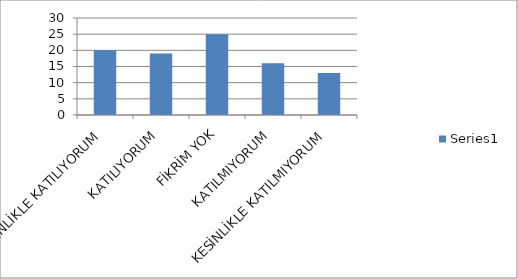
| Category | Series 0 |
|---|---|
| KESİNLİKLE KATILIYORUM | 20 |
| KATILIYORUM | 19 |
| FİKRİM YOK | 25 |
| KATILMIYORUM | 16 |
| KESİNLİKLE KATILMIYORUM | 13 |